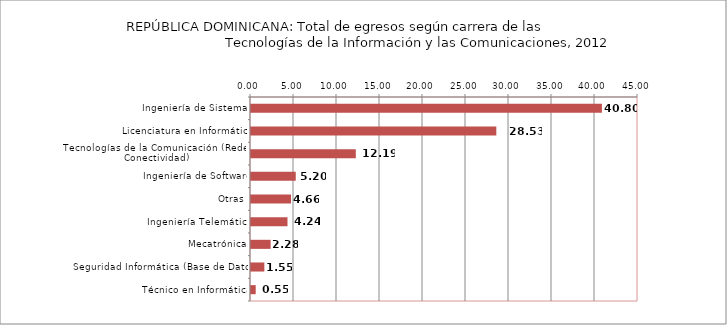
| Category | REPÚBLICA DOMINICANA: Total de egresos, según carrera de las 
Tecnologías de la Información y las Comunicaciones, 2012 |
|---|---|
| Ingeniería de Sistemas | 40.803 |
| Licenciatura en Informática | 28.526 |
| Tecnologías de la Comunicación (Redes y Conectividad) | 12.186 |
| Ingeniería de Software | 5.203 |
| Otras | 4.655 |
| Ingeniería Telemática | 4.245 |
| Mecatrónica | 2.282 |
| Seguridad Informática (Base de Datos) | 1.552 |
| Técnico en Informática | 0.548 |